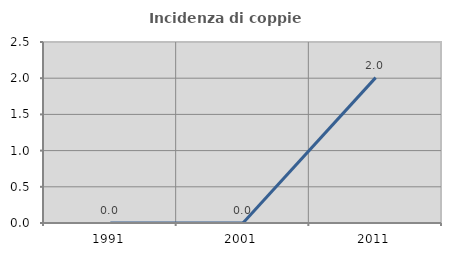
| Category | Incidenza di coppie miste |
|---|---|
| 1991.0 | 0 |
| 2001.0 | 0 |
| 2011.0 | 2.008 |